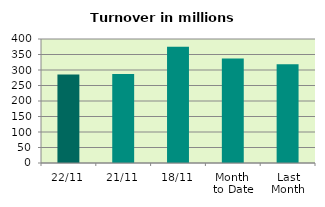
| Category | Series 0 |
|---|---|
| 22/11 | 285.76 |
| 21/11 | 286.834 |
| 18/11 | 374.666 |
| Month 
to Date | 337.265 |
| Last
Month | 318.176 |